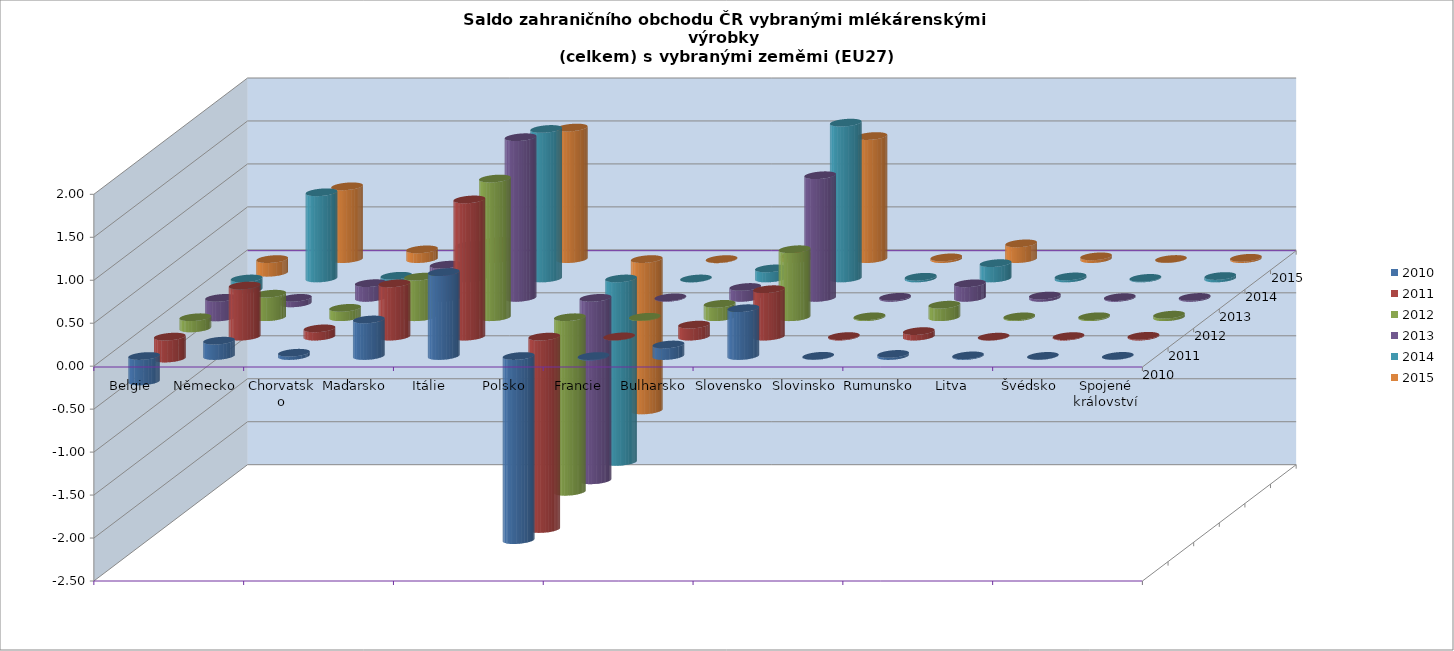
| Category | 2010 | 2011 | 2012 | 2013 | 2014 | 2015 |
|---|---|---|---|---|---|---|
| Belgie | -295539 | -255120 | -129707 | -227574 | -128990 | -159086 |
| Německo | 178338 | 594866 | 273940 | -63919 | 1003137 | 846928 |
| Chorvatsko | 38102 | 95940 | 109290 | 170932 | 31714 | 113134 |
| Maďarsko | 425362 | 619554 | 472302 | 385774 | 389700 | 211568 |
| Itálie | 975839 | 1596654 | 1614212 | 1869509 | 1739916 | 1530757 |
| Polsko | -2142497 | -2238657 | -2031128 | -2123111 | -2134538 | -1760959 |
| Francie | -7897 | 2837 | 5374 | 6090 | -1123 | -2493 |
| Bulharsko | 134187 | 139774 | 156138 | 126522 | 116839 | 44883 |
| Slovensko | 556240 | 551760 | 791535 | 1426982 | 1813688 | 1431945 |
| Slovinsko | 2377 | 6294 | 10726 | 11935 | 19882 | 19894 |
| Rumunsko | 24312 | 64290 | 145966 | 169186 | 178392 | 182956 |
| Litva  | 7397 | -1948 | 10308 | 27002 | 23864 | 32062 |
| Švédsko | 1431 | 6146 | 11485 | 8512 | 6866 | 1095 |
| Spojené království | 1595 | 9523 | 29559 | 10472 | 28641 | 14999 |